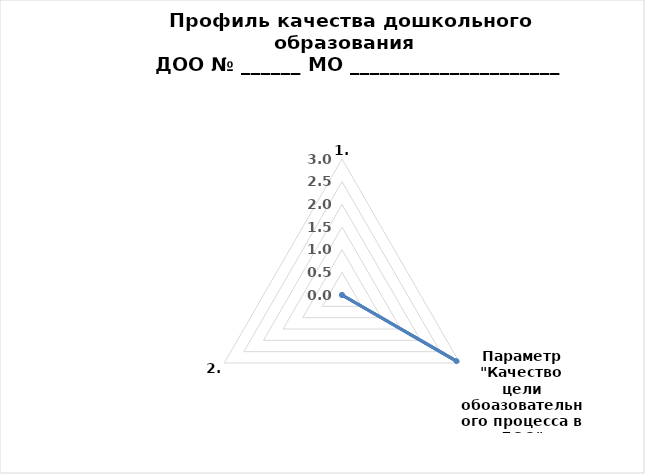
| Category | Оценка  в баллах |
|---|---|
| 0 | 0 |
| 1 | 2.917 |
| 2 | 0 |